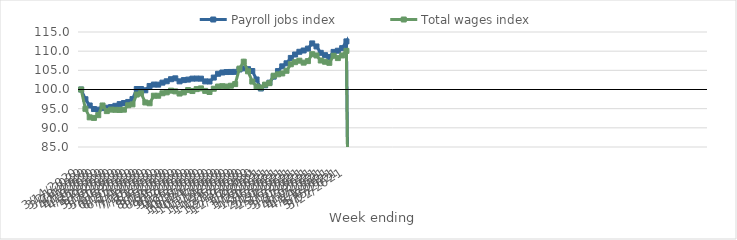
| Category | Payroll jobs index | Total wages index |
|---|---|---|
| 14/03/2020 | 100 | 100 |
| 21/03/2020 | 97.464 | 94.956 |
| 28/03/2020 | 95.834 | 92.732 |
| 04/04/2020 | 94.903 | 92.589 |
| 11/04/2020 | 94.746 | 93.3 |
| 18/04/2020 | 95.144 | 95.83 |
| 25/04/2020 | 95.254 | 94.363 |
| 02/05/2020 | 95.426 | 94.746 |
| 09/05/2020 | 95.737 | 94.705 |
| 16/05/2020 | 96.187 | 94.664 |
| 23/05/2020 | 96.47 | 94.736 |
| 30/05/2020 | 96.752 | 95.888 |
| 06/06/2020 | 97.504 | 96.117 |
| 13/06/2020 | 100.13 | 98.686 |
| 20/06/2020 | 100.128 | 99.003 |
| 27/06/2020 | 99.796 | 96.619 |
| 04/07/2020 | 100.919 | 96.408 |
| 11/07/2020 | 101.291 | 98.379 |
| 18/07/2020 | 101.27 | 98.371 |
| 25/07/2020 | 101.791 | 99.014 |
| 01/08/2020 | 102.144 | 99.255 |
| 08/08/2020 | 102.683 | 99.698 |
| 15/08/2020 | 102.913 | 99.505 |
| 22/08/2020 | 102.127 | 98.947 |
| 29/08/2020 | 102.451 | 99.242 |
| 05/09/2020 | 102.585 | 99.848 |
| 12/09/2020 | 102.84 | 99.597 |
| 19/09/2020 | 102.85 | 100.101 |
| 26/09/2020 | 102.832 | 100.282 |
| 03/10/2020 | 102.114 | 99.641 |
| 10/10/2020 | 102.083 | 99.348 |
| 17/10/2020 | 103.107 | 100.202 |
| 24/10/2020 | 104.101 | 100.774 |
| 31/10/2020 | 104.433 | 100.867 |
| 07/11/2020 | 104.553 | 100.77 |
| 14/11/2020 | 104.579 | 100.986 |
| 21/11/2020 | 104.599 | 101.414 |
| 28/11/2020 | 105.22 | 105.45 |
| 05/12/2020 | 105.51 | 107.256 |
| 12/12/2020 | 105.311 | 104.748 |
| 19/12/2020 | 104.822 | 102.07 |
| 26/12/2020 | 102.611 | 100.795 |
| 02/01/2021 | 100.256 | 100.528 |
| 09/01/2021 | 101.104 | 101.268 |
| 16/01/2021 | 101.781 | 101.655 |
| 23/01/2021 | 103.352 | 103.6 |
| 30/01/2021 | 104.808 | 103.961 |
| 06/02/2021 | 106.04 | 104.186 |
| 13/02/2021 | 106.836 | 104.883 |
| 20/02/2021 | 108.234 | 106.584 |
| 27/02/2021 | 109.125 | 107.129 |
| 06/03/2021 | 109.837 | 107.508 |
| 13/03/2021 | 110.176 | 107.008 |
| 20/03/2021 | 110.67 | 107.404 |
| 27/03/2021 | 112.024 | 109.217 |
| 03/04/2021 | 111.228 | 108.882 |
| 10/04/2021 | 109.568 | 107.557 |
| 17/04/2021 | 108.958 | 107.236 |
| 24/04/2021 | 108.486 | 106.955 |
| 01/05/2021 | 109.811 | 108.808 |
| 08/05/2021 | 110.119 | 108.192 |
| 15/05/2021 | 110.788 | 108.878 |
| 22/05/2021 | 112.548 | 110.075 |